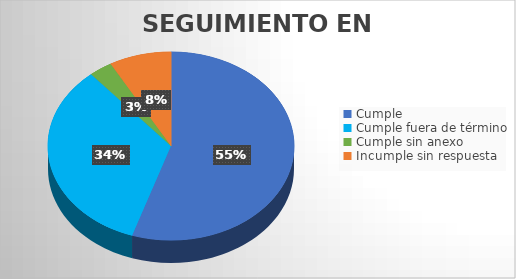
| Category | TOTAL |
|---|---|
| Cumple | 54 |
| Cumple fuera de término | 33 |
| Cumple sin anexo | 3 |
| Incumple sin respuesta | 8 |